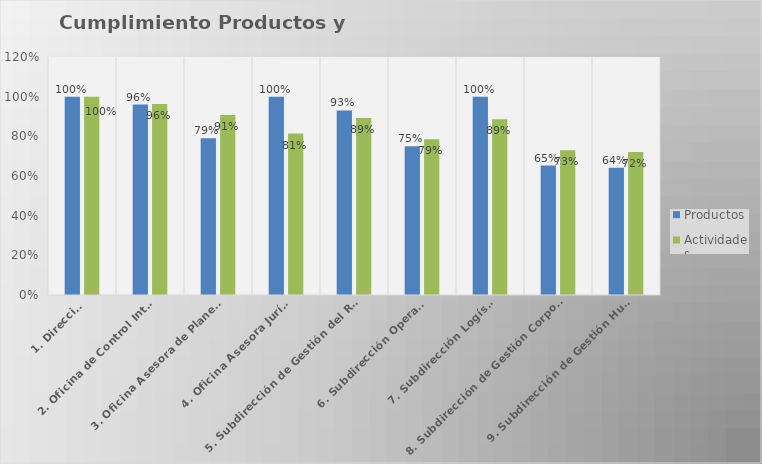
| Category | Productos | Actividades |
|---|---|---|
| 1. Dirección | 1 | 1 |
| 2. Oficina de Control Interno | 0.96 | 0.963 |
| 3. Oficina Asesora de Planeación | 0.791 | 0.908 |
| 4. Oficina Asesora Jurídica | 1 | 0.814 |
| 5. Subdirección de Gestión del Riesgo | 0.931 | 0.892 |
| 6. Subdirección Operativa | 0.75 | 0.786 |
| 7. Subdirección Logística | 1 | 0.886 |
| 8. Subdirección de Gestión Corporativa | 0.652 | 0.73 |
| 9. Subdirección de Gestión Humana | 0.642 | 0.721 |